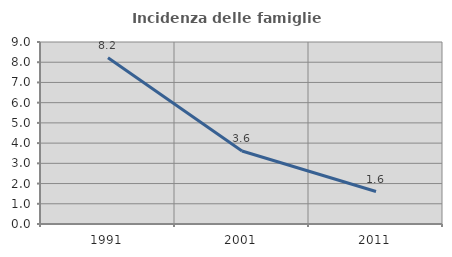
| Category | Incidenza delle famiglie numerose |
|---|---|
| 1991.0 | 8.222 |
| 2001.0 | 3.609 |
| 2011.0 | 1.604 |